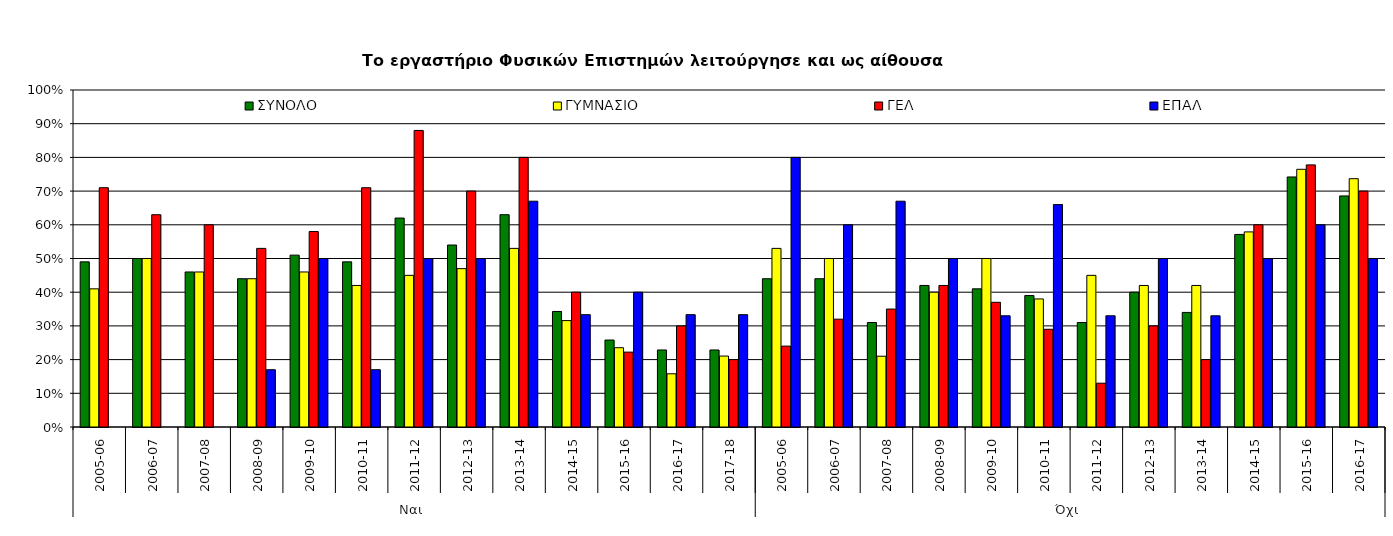
| Category | ΣΥΝΟΛΟ | ΓΥΜΝΑΣΙΟ | ΓΕΛ | ΕΠΑΛ |
|---|---|---|---|---|
| 0 | 0.49 | 0.41 | 0.71 | 0 |
| 1 | 0.5 | 0.5 | 0.63 | 0 |
| 2 | 0.46 | 0.46 | 0.6 | 0 |
| 3 | 0.44 | 0.44 | 0.53 | 0.17 |
| 4 | 0.51 | 0.46 | 0.58 | 0.5 |
| 5 | 0.49 | 0.42 | 0.71 | 0.17 |
| 6 | 0.62 | 0.45 | 0.88 | 0.5 |
| 7 | 0.54 | 0.47 | 0.7 | 0.5 |
| 8 | 0.63 | 0.53 | 0.8 | 0.67 |
| 9 | 0.343 | 0.316 | 0.4 | 0.333 |
| 10 | 0.258 | 0.235 | 0.222 | 0.4 |
| 11 | 0.229 | 0.158 | 0.3 | 0.333 |
| 12 | 0.229 | 0.211 | 0.2 | 0.333 |
| 13 | 0.44 | 0.53 | 0.24 | 0.8 |
| 14 | 0.44 | 0.5 | 0.32 | 0.6 |
| 15 | 0.31 | 0.21 | 0.35 | 0.67 |
| 16 | 0.42 | 0.4 | 0.42 | 0.5 |
| 17 | 0.41 | 0.5 | 0.37 | 0.33 |
| 18 | 0.39 | 0.38 | 0.29 | 0.66 |
| 19 | 0.31 | 0.45 | 0.13 | 0.33 |
| 20 | 0.4 | 0.42 | 0.3 | 0.5 |
| 21 | 0.34 | 0.42 | 0.2 | 0.33 |
| 22 | 0.571 | 0.579 | 0.6 | 0.5 |
| 23 | 0.742 | 0.765 | 0.778 | 0.6 |
| 24 | 0.686 | 0.737 | 0.7 | 0.5 |